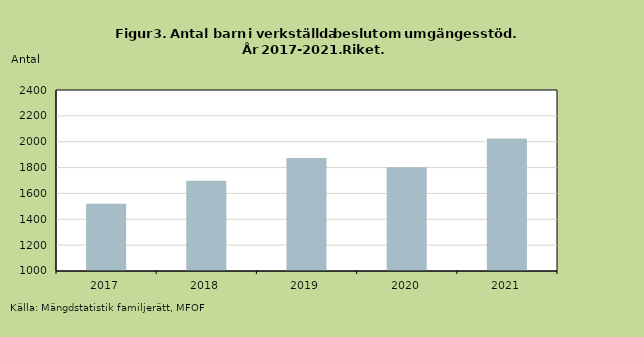
| Category | Series 1 |
|---|---|
| 2017.0 | 1521 |
| 2018.0 | 1699 |
| 2019.0 | 1875 |
| 2020.0 | 1802 |
| 2021.0 | 2025 |